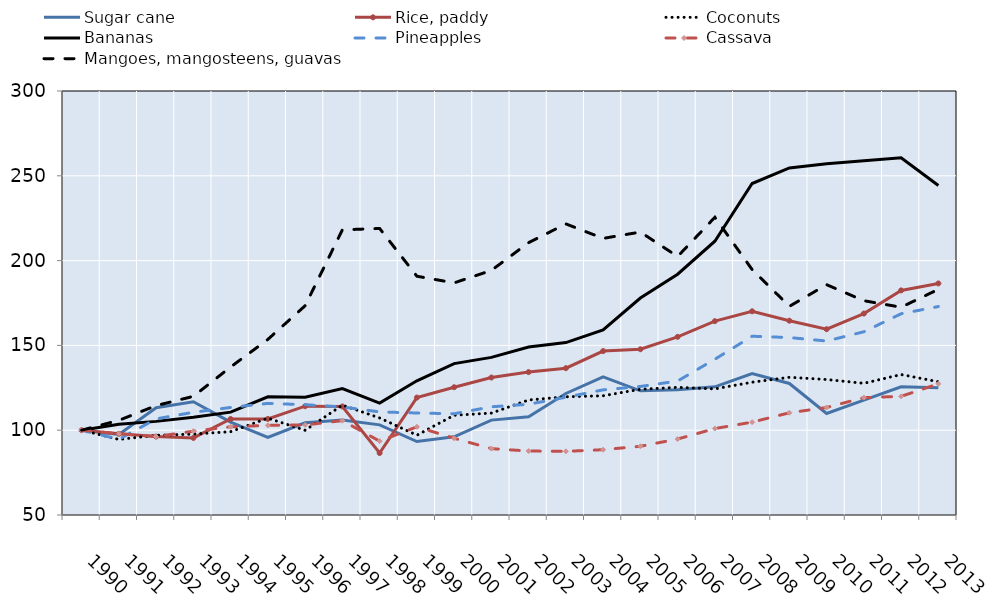
| Category | Sugar cane | Rice, paddy | Coconuts | Bananas | Pineapples | Cassava | Mangoes, mangosteens, guavas |
|---|---|---|---|---|---|---|---|
|  1990 | 100 | 100 | 100 | 100 | 100 | 100 | 100 |
|  1991 | 97.461 | 97.858 | 94.562 | 103.466 | 94.65 | 97.922 | 105.817 |
|  1992 | 113.241 | 96.237 | 96.972 | 105.206 | 106.684 | 96.242 | 114.506 |
|  1993 | 116.741 | 95.44 | 97.718 | 107.621 | 110.561 | 99.443 | 119.961 |
|  1994 | 104.756 | 106.607 | 99.122 | 110.644 | 113.411 | 102.003 | 137.271 |
|  1995 | 95.754 | 106.633 | 107.108 | 119.681 | 115.799 | 102.833 | 153.544 |
|  1996 | 104.356 | 114.148 | 99.956 | 119.48 | 115.058 | 103.097 | 173.389 |
|  1997 | 105.957 | 114.001 | 114.787 | 124.524 | 113.678 | 105.645 | 218.123 |
|  1998 | 103.159 | 86.543 | 107.239 | 116.021 | 110.796 | 93.549 | 218.95 |
|  1999 | 93.321 | 119.237 | 97.044 | 129.128 | 110.144 | 101.993 | 190.796 |
|  2000 | 96.111 | 125.335 | 108.815 | 139.268 | 109.7 | 95.269 | 186.862 |
|  2001 | 105.957 | 131.056 | 110.083 | 142.935 | 113.804 | 89.136 | 194.215 |
|  2002 | 107.919 | 134.25 | 117.807 | 149.023 | 115.299 | 87.717 | 210.586 |
|  2003 | 121.655 | 136.57 | 119.697 | 151.682 | 119.434 | 87.529 | 221.635 |
|  2004 | 131.465 | 146.654 | 120.3 | 159.092 | 123.786 | 88.515 | 213.106 |
|  2005 | 123.224 | 147.729 | 124.139 | 177.935 | 125.784 | 90.513 | 216.822 |
|  2006 | 123.813 | 155.05 | 125.255 | 191.958 | 128.998 | 94.792 | 202.436 |
|  2007 | 125.579 | 164.291 | 124.376 | 211.437 | 141.838 | 100.958 | 225.537 |
|  2008 | 133.428 | 170.112 | 128.283 | 245.44 | 155.405 | 104.759 | 194.722 |
|  2009 | 127.541 | 164.557 | 131.198 | 254.637 | 154.643 | 110.27 | 173.025 |
|  2010 | 109.881 | 159.558 | 129.881 | 257.128 | 152.584 | 113.385 | 185.8 |
|  2011 | 117.73 | 168.782 | 127.656 | 258.928 | 158.041 | 119.224 | 176.338 |
|  2012 | 125.579 | 182.422 | 132.829 | 260.65 | 168.65 | 119.95 | 172.522 |
|  2013 | 125.084 | 186.539 | 128.565 | 244.257 | 172.926 | 127.363 | 183.051 |